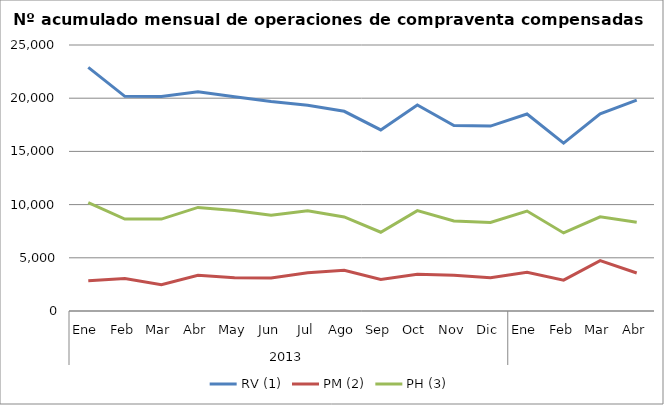
| Category | RV (1) | PM (2) | PH (3) |
|---|---|---|---|
| 0 | 22894 | 2853 | 10176 |
| 1 | 20174 | 3047 | 8641 |
| 2 | 20169 | 2472 | 8638 |
| 3 | 20616 | 3350 | 9736 |
| 4 | 20126 | 3117 | 9441 |
| 5 | 19686 | 3099 | 9000 |
| 6 | 19337 | 3588 | 9415 |
| 7 | 18769 | 3829 | 8838 |
| 8 | 17015 | 2969 | 7402 |
| 9 | 19371 | 3453 | 9435 |
| 10 | 17427 | 3359 | 8465 |
| 11 | 17377 | 3135 | 8315 |
| 12 | 18515 | 3629 | 9396 |
| 13 | 15776 | 2899 | 7337 |
| 14 | 18527 | 4739 | 8846 |
| 15 | 19824 | 3575 | 8345 |